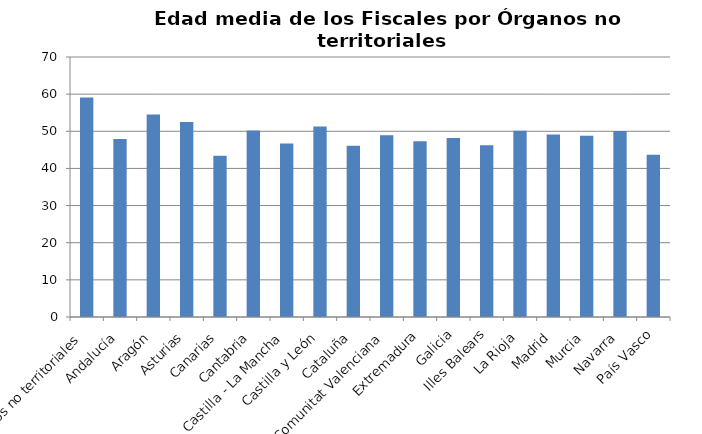
| Category | Edad Media |
|---|---|
| Órganos no territoriales | 59.08 |
| Andalucía | 47.908 |
| Aragón | 54.497 |
| Asturias | 52.498 |
| Canarias | 43.407 |
| Cantabria | 50.183 |
| Castilla - La Mancha | 46.743 |
| Castilla y León | 51.281 |
| Cataluña | 46.116 |
| Comunitat Valenciana | 48.919 |
| Extremadura | 47.294 |
| Galicia | 48.18 |
| Illes Balears | 46.256 |
| La Rioja | 50.155 |
| Madrid | 49.168 |
| Murcia | 48.824 |
| Navarra | 50.094 |
| País Vasco | 43.667 |